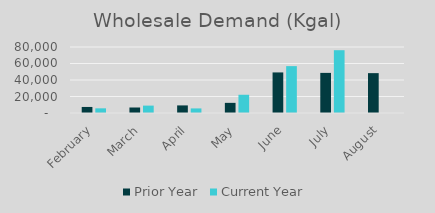
| Category | Prior Year | Current Year |
|---|---|---|
| February | 7328 | 5662 |
| March | 6673 | 8964 |
| April | 9201 | 5557 |
| May | 12299 | 22105 |
| June | 49180 | 56817 |
| July | 48620 | 76109 |
| August | 48323 | 0 |